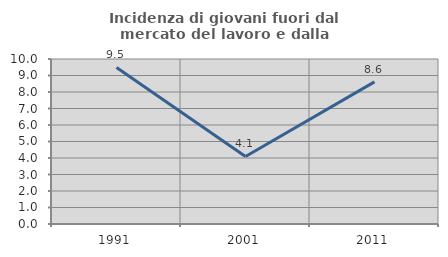
| Category | Incidenza di giovani fuori dal mercato del lavoro e dalla formazione  |
|---|---|
| 1991.0 | 9.49 |
| 2001.0 | 4.095 |
| 2011.0 | 8.616 |